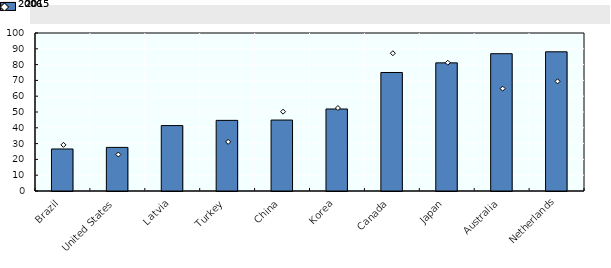
| Category | 2015 |
|---|---|
| Brazil | 26.6 |
| United States | 27.6 |
| Latvia | 41.4 |
| Turkey | 44.7 |
| China | 44.9 |
| Korea | 51.9 |
| Canada | 75 |
| Japan | 81.1 |
| Australia | 86.9 |
| Netherlands | 88.1 |